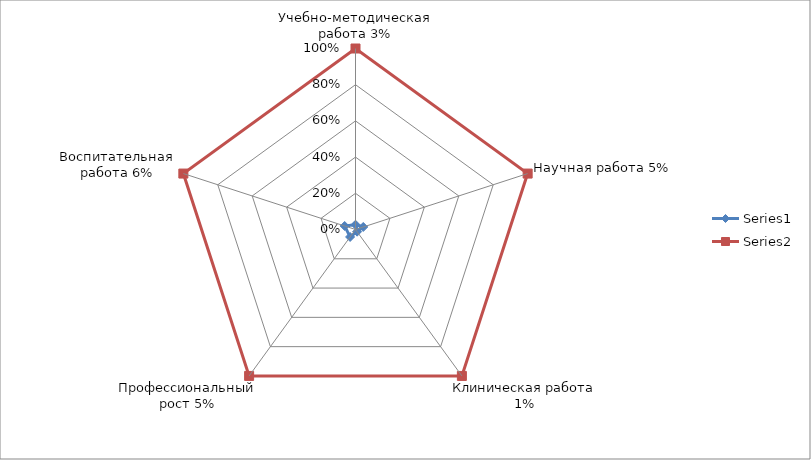
| Category | Series 0 | Series 1 |
|---|---|---|
| Учебно-методическая работа 3% | 0.026 | 1 |
| Научная работа 5% | 0.045 | 1 |
| Клиническая работа 1% | 0.015 | 1 |
| Профессиональный рост 5% | 0.051 | 1 |
| Воспитательная работа 6% | 0.063 | 1 |